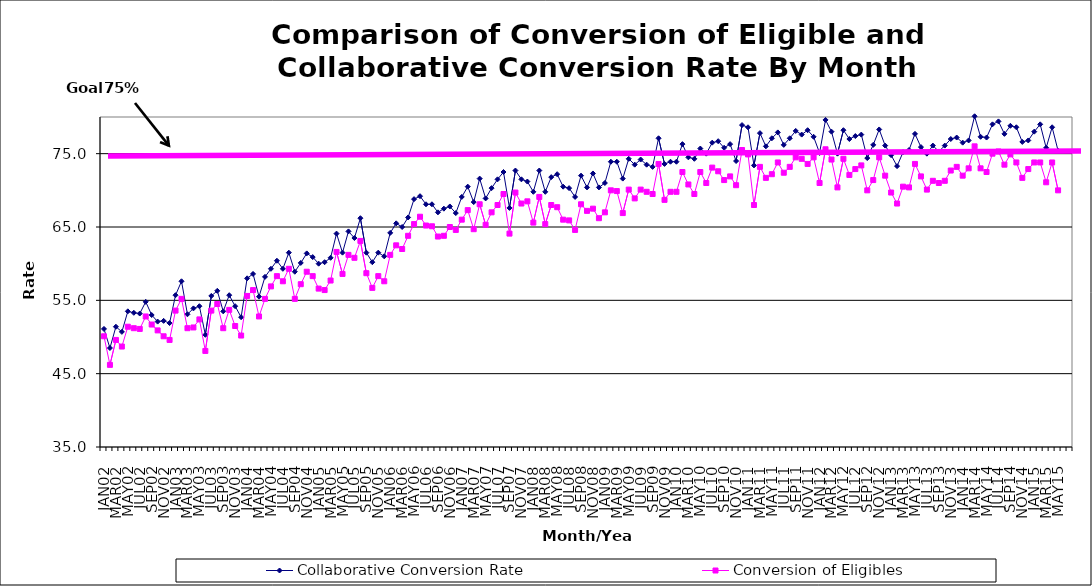
| Category | Collaborative Conversion Rate | Conversion of Eligibles |
|---|---|---|
| JAN02 | 51.1 | 50.1 |
| FEB02 | 48.5 | 46.2 |
| MAR02 | 51.4 | 49.6 |
| APR02 | 50.7 | 48.7 |
| MAY02 | 53.5 | 51.4 |
| JUN02 | 53.3 | 51.2 |
| JUL02 | 53.2 | 51.1 |
| AUG02 | 54.8 | 52.8 |
| SEP02 | 53 | 51.7 |
| OCT02 | 52.1 | 50.9 |
| NOV02 | 52.2 | 50.1 |
| DEC02 | 51.9 | 49.6 |
| JAN03 | 55.7 | 53.6 |
| FEB03 | 57.6 | 55.2 |
| MAR03 | 53.1 | 51.2 |
| APR03 | 53.9 | 51.3 |
| MAY03 | 54.2 | 52.4 |
| JUN03 | 50.3 | 48.1 |
| JUL03 | 55.6 | 53.6 |
| AUG03 | 56.3 | 54.5 |
| SEP03 | 53.5 | 51.2 |
| OCT03 | 55.7 | 53.7 |
| NOV03 | 54.2 | 51.5 |
| DEC03 | 52.7 | 50.2 |
| JAN04 | 58 | 55.6 |
| FEB04 | 58.6 | 56.4 |
| MAR04 | 55.5 | 52.8 |
| APR04 | 58.2 | 55.2 |
| MAY04 | 59.3 | 56.9 |
| JUN04 | 60.4 | 58.3 |
| JUL04 | 59.3 | 57.6 |
| AUG04 | 61.5 | 59.3 |
| SEP04 | 58.9 | 55.2 |
| OCT04 | 60.1 | 57.2 |
| NOV04 | 61.4 | 58.9 |
| DEC04 | 60.9 | 58.3 |
| JAN05 | 60 | 56.6 |
| FEB05 | 60.2 | 56.4 |
| MAR05 | 60.8 | 57.7 |
| APR05 | 64.1 | 61.6 |
| MAY05 | 61.5 | 58.6 |
| JUN05 | 64.4 | 61.2 |
| JUL05 | 63.5 | 60.8 |
| AUG05 | 66.2 | 63.1 |
| SEP05 | 61.5 | 58.7 |
| OCT05 | 60.2 | 56.7 |
| NOV05 | 61.5 | 58.3 |
| DEC05 | 61 | 57.6 |
| JAN06 | 64.2 | 61.2 |
| FEB06 | 65.5 | 62.5 |
| MAR06 | 65 | 62 |
| APR06 | 66.3 | 63.8 |
| MAY06 | 68.8 | 65.4 |
| JUN06 | 69.2 | 66.4 |
| JUL06 | 68.1 | 65.2 |
| AUG06 | 68.1 | 65.1 |
| SEP06 | 67 | 63.7 |
| OCT06 | 67.5 | 63.8 |
| NOV06 | 67.8 | 65 |
| DEC06 | 66.9 | 64.6 |
| JAN07 | 69.1 | 66 |
| FEB07 | 70.5 | 67.3 |
| MAR07 | 68.4 | 64.7 |
| APR07 | 71.6 | 68.1 |
| MAY07 | 68.9 | 65.3 |
| JUN07 | 70.3 | 67 |
| JUL07 | 71.5 | 68 |
| AUG07 | 72.5 | 69.5 |
| SEP07 | 67.6 | 64.1 |
| OCT07 | 72.7 | 69.7 |
| NOV07 | 71.5 | 68.2 |
| DEC07 | 71.2 | 68.5 |
| JAN08 | 69.8 | 65.6 |
| FEB08 | 72.7 | 69.1 |
| MAR08 | 69.8 | 65.4 |
| APR08 | 71.8 | 68 |
| MAY08 | 72.2 | 67.7 |
| JUN08 | 70.5 | 66 |
| JUL08 | 70.3 | 65.9 |
| AUG08 | 69.1 | 64.6 |
| SEP08 | 72 | 68.1 |
| OCT08 | 70.4 | 67.2 |
| NOV08 | 72.3 | 67.5 |
| DEC08 | 70.4 | 66.2 |
| JAN09 | 71 | 67 |
| FEB09 | 73.9 | 70 |
| MAR09 | 73.9 | 69.9 |
| APR09 | 71.6 | 66.9 |
| MAY09 | 74.3 | 70.1 |
| JUN09 | 73.5 | 68.9 |
| JUL09 | 74.2 | 70.1 |
| AUG09 | 73.5 | 69.8 |
| SEP09 | 73.2 | 69.5 |
| OCT09 | 77.1 | 73.6 |
| NOV09 | 73.6 | 68.7 |
| DEC09 | 73.9 | 69.8 |
| JAN10 | 73.9 | 69.8 |
| FEB10 | 76.3 | 72.5 |
| MAR10 | 74.5 | 70.8 |
| APR10 | 74.3 | 69.5 |
| MAY10 | 75.7 | 72.5 |
| JUN10 | 75 | 71 |
| JUL10 | 76.5 | 73.1 |
| AUG10 | 76.7 | 72.6 |
| SEP10 | 75.8 | 71.4 |
| OCT10 | 76.3 | 71.9 |
| NOV10 | 74 | 70.7 |
| DEC10 | 78.9 | 75.5 |
| JAN11 | 78.6 | 74.9 |
| FEB11 | 73.4 | 68 |
| MAR11 | 77.8 | 73.2 |
| APR11 | 76 | 71.7 |
| MAY11 | 77.1 | 72.2 |
| JUN11 | 77.9 | 73.8 |
| JUL11 | 76.2 | 72.4 |
| AUG11 | 77.1 | 73.2 |
| SEP11 | 78.1 | 74.5 |
| OCT11 | 77.6 | 74.3 |
| NOV11 | 78.2 | 73.6 |
| DEC11 | 77.3 | 74.5 |
| JAN12 | 75.1 | 71 |
| FEB12 | 79.6 | 75.6 |
| MAR12 | 78 | 74.2 |
| APR12 | 75 | 70.4 |
| MAY12 | 78.2 | 74.3 |
| JUN12 | 77 | 72.1 |
| JUL12 | 77.4 | 72.9 |
| AUG12 | 77.6 | 73.4 |
| SEP12 | 74.4 | 70 |
| OCT12 | 76.2 | 71.4 |
| NOV12 | 78.3 | 74.5 |
| DEC12 | 76.1 | 72 |
| JAN13 | 74.8 | 69.7 |
| FEB13 | 73.3 | 68.2 |
| MAR13 | 75.2 | 70.5 |
| APR13 | 75.5 | 70.4 |
| MAY13 | 77.7 | 73.6 |
| JUN13 | 75.9 | 71.9 |
| JUL13 | 75 | 70.1 |
| AUG13 | 76.1 | 71.3 |
| SEP13 | 75.3 | 71 |
| OCT13 | 76.1 | 71.3 |
| NOV13 | 77 | 72.7 |
| DEC13 | 77.2 | 73.2 |
| JAN14 | 76.5 | 72 |
| FEB14 | 76.8 | 73 |
| MAR14 | 80.1 | 76 |
| APR14 | 77.3 | 73 |
| MAY14 | 77.2 | 72.5 |
| JUN14 | 79 | 75 |
| JUL14 | 79.4 | 75.3 |
| AUG14 | 77.7 | 73.5 |
| SEP14 | 78.8 | 74.9 |
| OCT14 | 78.6 | 73.8 |
| NOV14 | 76.6 | 71.7 |
| DEC14 | 76.8 | 72.9 |
| JAN15 | 78 | 73.8 |
| FEB15 | 79 | 73.8 |
| MAR15 | 75.8 | 71.1 |
| APR15 | 78.6 | 73.8 |
| MAY15 | 75.4 | 70 |